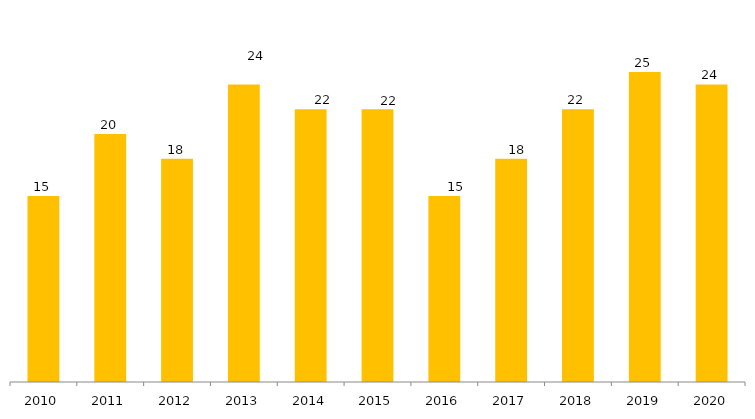
| Category | Grande Área CNPq |
|---|---|
| 2010.0 | 15 |
| 2011.0 | 20 |
| 2012.0 | 18 |
| 2013.0 | 24 |
| 2014.0 | 22 |
| 2015.0 | 22 |
| 2016.0 | 15 |
| 2017.0 | 18 |
| 2018.0 | 22 |
| 2019.0 | 25 |
| 2020.0 | 24 |